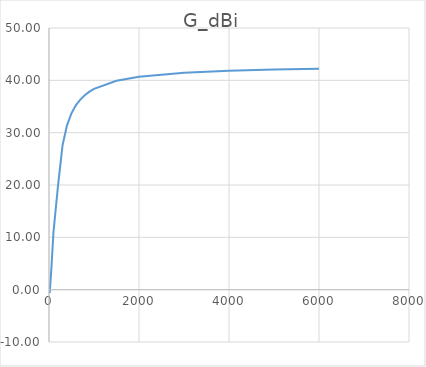
| Category | G_dBi |
|---|---|
| 15.0 | -0.667 |
| 50.0 | 3.641 |
| 100.0 | 11.057 |
| 200.0 | 19.839 |
| 300.0 | 27.543 |
| 400.0 | 31.403 |
| 500.0 | 33.721 |
| 600.0 | 35.267 |
| 700.0 | 36.371 |
| 800.0 | 37.199 |
| 900.0 | 37.844 |
| 1000.0 | 38.359 |
| 1500.0 | 39.906 |
| 2000.0 | 40.68 |
| 3000.0 | 41.453 |
| 4000.0 | 41.84 |
| 5000.0 | 42.072 |
| 6000.0 | 42.227 |